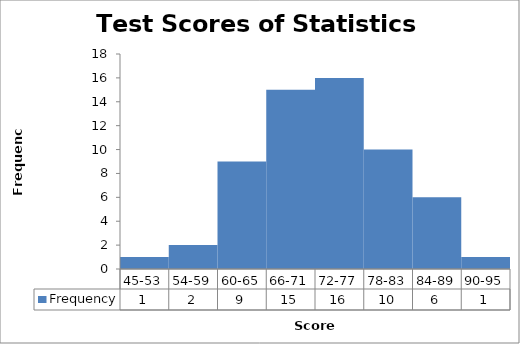
| Category | Frequency |
|---|---|
| 45-53 | 1 |
| 54-59 | 2 |
| 60-65 | 9 |
| 66-71 | 15 |
| 72-77 | 16 |
| 78-83 | 10 |
| 84-89 | 6 |
| 90-95 | 1 |